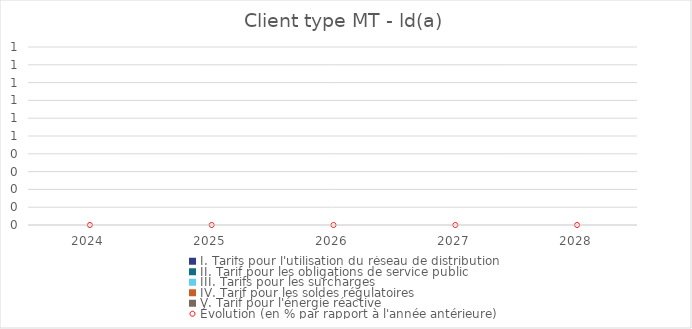
| Category | I. Tarifs pour l'utilisation du réseau de distribution | II. Tarif pour les obligations de service public  | III. Tarifs pour les surcharges   | IV. Tarif pour les soldes régulatoires | V. Tarif pour l'énergie réactive |
|---|---|---|---|---|---|
| 2024.0 | 0 | 0 | 0 | 0 | 0 |
| 2025.0 | 0 | 0 | 0 | 0 | 0 |
| 2026.0 | 0 | 0 | 0 | 0 | 0 |
| 2027.0 | 0 | 0 | 0 | 0 | 0 |
| 2028.0 | 0 | 0 | 0 | 0 | 0 |